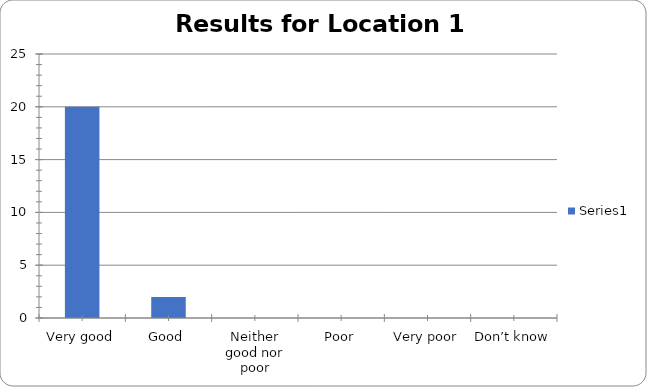
| Category | Series 0 |
|---|---|
| Very good | 20 |
| Good | 2 |
| Neither good nor poor | 0 |
| Poor | 0 |
| Very poor | 0 |
| Don’t know | 0 |